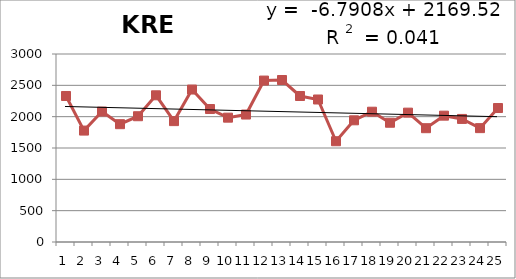
| Category | 1988-2012 |
|---|---|
| 0 | 2330 |
| 1 | 1778 |
| 2 | 2081 |
| 3 | 1880 |
| 4 | 2007 |
| 5 | 2341 |
| 6 | 1929 |
| 7 | 2433 |
| 8 | 2122 |
| 9 | 1984 |
| 10 | 2034 |
| 11 | 2576 |
| 12 | 2585 |
| 13 | 2330 |
| 14 | 2274 |
| 15 | 1608 |
| 16 | 1942 |
| 17 | 2079 |
| 18 | 1903 |
| 19 | 2064 |
| 20 | 1816 |
| 21 | 2016 |
| 22 | 1964 |
| 23 | 1817 |
| 24 | 2138 |